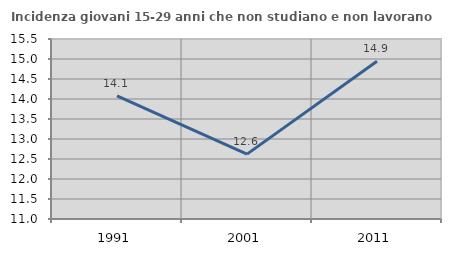
| Category | Incidenza giovani 15-29 anni che non studiano e non lavorano  |
|---|---|
| 1991.0 | 14.078 |
| 2001.0 | 12.623 |
| 2011.0 | 14.944 |